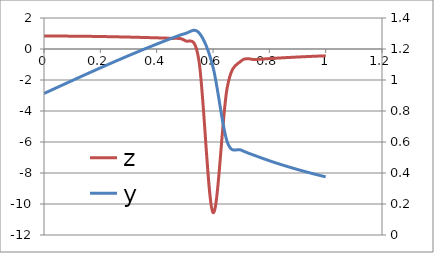
| Category | z |
|---|---|
| 0.0 | 0.835 |
| 0.05 | 0.834 |
| 0.1 | 0.829 |
| 0.15000000000000002 | 0.82 |
| 0.2 | 0.806 |
| 0.25 | 0.789 |
| 0.3 | 0.769 |
| 0.35 | 0.746 |
| 0.39999999999999997 | 0.72 |
| 0.44999999999999996 | 0.685 |
| 0.49999999999999994 | 0.55 |
| 0.5499999999999999 | -0.74 |
| 0.6 | -10.552 |
| 0.65 | -2.532 |
| 0.7000000000000001 | -0.767 |
| 0.7500000000000001 | -0.684 |
| 0.8000000000000002 | -0.619 |
| 0.8500000000000002 | -0.564 |
| 0.9000000000000002 | -0.517 |
| 0.9500000000000003 | -0.476 |
| 1.0 | -0.439 |